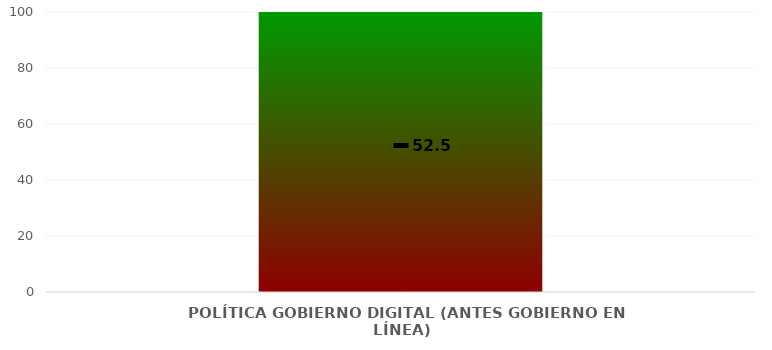
| Category | Niveles |
|---|---|
| POLÍTICA GOBIERNO DIGITAL (ANTES GOBIERNO EN LÍNEA) | 100 |